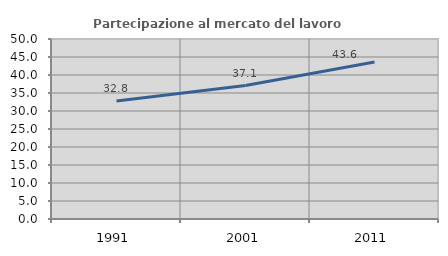
| Category | Partecipazione al mercato del lavoro  femminile |
|---|---|
| 1991.0 | 32.799 |
| 2001.0 | 37.065 |
| 2011.0 | 43.627 |